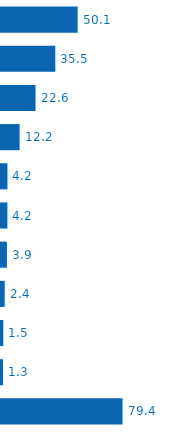
| Category | Series 0 |
|---|---|
| United States | 50106536 |
| Japan | 35500000 |
| United Kingdom | 22577242 |
| Canada | 12171373 |
| Germany | 4213995 |
| Australia | 4188537 |
| European Commission | 3874564 |
| Switzerland | 2421423 |
| Denmark | 1489000 |
| Finland | 1293661 |
| Others | 79430565 |